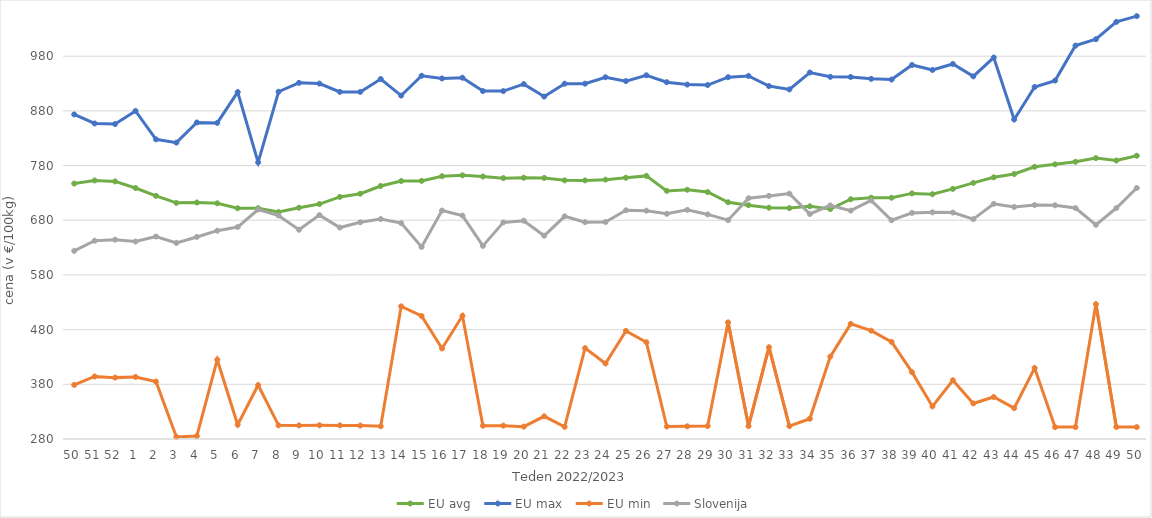
| Category | EU avg | EU max | EU min | Slovenija |
|---|---|---|---|---|
| 50.0 | 747.172 | 873.539 | 378.982 | 624.04 |
| 51.0 | 752.816 | 857 | 394.338 | 642.65 |
| 52.0 | 751.074 | 856 | 392.239 | 644.53 |
| 1.0 | 739.046 | 879.85 | 393.489 | 641.12 |
| 2.0 | 724.639 | 828 | 384.981 | 650.2 |
| 3.0 | 711.851 | 822 | 283.843 | 638.53 |
| 4.0 | 712.49 | 858.87 | 285.37 | 649.48 |
| 5.0 | 711.017 | 858.04 | 424.979 | 660.95 |
| 6.0 | 701.929 | 914.33 | 306.082 | 667.54 |
| 7.0 | 702.069 | 786 | 378.59 | 699.7 |
| 8.0 | 695.064 | 915.02 | 304.96 | 688.66 |
| 9.0 | 702.969 | 931.32 | 304.825 | 662.64 |
| 10.0 | 709.663 | 929.95 | 305.084 | 689.44 |
| 11.0 | 722.709 | 914.74 | 304.898 | 666.74 |
| 12.0 | 728.602 | 914.74 | 304.596 | 676.37 |
| 13.0 | 742.694 | 938.32 | 303.296 | 682.23 |
| 14.0 | 751.755 | 907.97 | 522.592 | 674.78 |
| 15.0 | 752.021 | 944.23 | 504.96 | 631.19 |
| 16.0 | 760.592 | 939.34 | 445.532 | 697.8 |
| 17.0 | 762.183 | 940.65 | 505.33 | 688.5 |
| 18.0 | 760.015 | 916.26 | 304.291 | 633.15 |
| 19.0 | 757.059 | 916.26 | 304.433 | 676.12 |
| 20.0 | 757.831 | 928.97 | 302.55 | 679.25 |
| 21.0 | 757.385 | 906.19 | 321.503 | 651.69 |
| 22.0 | 752.969 | 929.74 | 302.257 | 687.26 |
| 23.0 | 752.886 | 929.78 | 446.137 | 676.52 |
| 24.0 | 754.283 | 941.55 | 418.061 | 676.83 |
| 25.0 | 757.77 | 934.45 | 477.67 | 698.25 |
| 26.0 | 761.163 | 945.18 | 456.948 | 697.54 |
| 27.0 | 733.742 | 932.53 | 302.781 | 691.8 |
| 28.0 | 735.75 | 928.14 | 303.168 | 699 |
| 29.0 | 731.645 | 927.29 | 303.655 | 690.7 |
| 30.0 | 712.961 | 941.59 | 493.33 | 680.17 |
| 31.0 | 707.534 | 943.92 | 303.673 | 720.34 |
| 32.0 | 702.931 | 925.39 | 447.846 | 724.52 |
| 33.0 | 702.24 | 919.19 | 303.592 | 728.72 |
| 34.0 | 705.541 | 950.2 | 317.026 | 691.49 |
| 35.0 | 700.508 | 942.32 | 430.612 | 707.11 |
| 36.0 | 718.437 | 942.05 | 490.576 | 697.6 |
| 37.0 | 721.306 | 938.6 | 478.078 | 716.35 |
| 38.0 | 721.207 | 937.3 | 457.569 | 680.02 |
| 39.0 | 729.129 | 963.96 | 402.258 | 693.43 |
| 40.0 | 727.729 | 954.84 | 339.558 | 694.47 |
| 41.0 | 737.408 | 965.83 | 387.408 | 694.11 |
| 42.0 | 748.363 | 943.12 | 345.032 | 682 |
| 43.0 | 758.542 | 977.6 | 356.832 | 710.04 |
| 44.0 | 764.625 | 864.39 | 336.464 | 704.35 |
| 45.0 | 777.738 | 923.69 | 409.716 | 707.91 |
| 46.0 | 782.321 | 935.37 | 301.74 | 707.39 |
| 47.0 | 787.005 | 999.38 | 301.764 | 702.35 |
| 48.0 | 793.637 | 1011.06 | 526.665 | 671.66 |
| 49.0 | 789.208 | 1042.78 | 301.922 | 702.38 |
| 50.0 | 797.968 | 1053.28 | 301.731 | 738.98 |